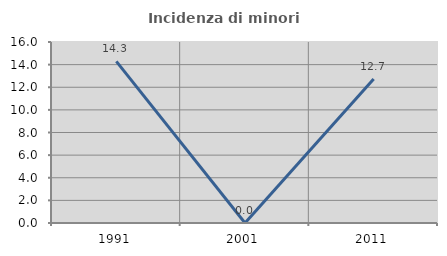
| Category | Incidenza di minori stranieri |
|---|---|
| 1991.0 | 14.286 |
| 2001.0 | 0 |
| 2011.0 | 12.727 |